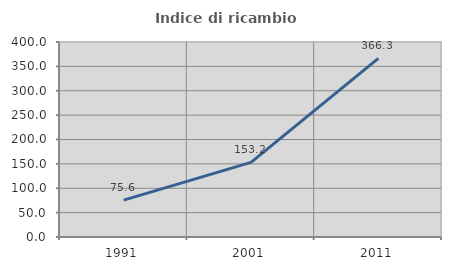
| Category | Indice di ricambio occupazionale  |
|---|---|
| 1991.0 | 75.559 |
| 2001.0 | 153.176 |
| 2011.0 | 366.275 |